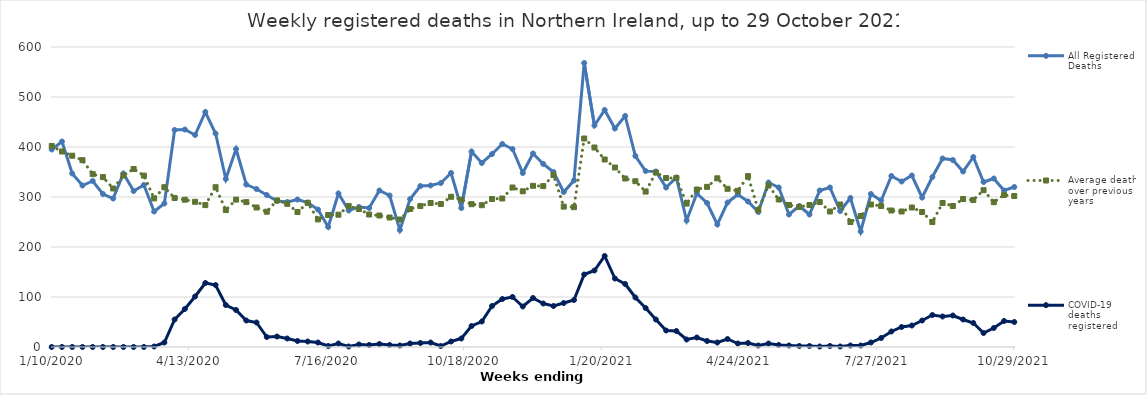
| Category | All Registered Deaths | Average deaths over previous 5 years | COVID-19 deaths registered |
|---|---|---|---|
| 1/10/20 | 395 | 402 | 0 |
| 1/17/20 | 411 | 391 | 0 |
| 1/24/20 | 347 | 382.6 | 0 |
| 1/31/20 | 323 | 373.6 | 0 |
| 2/7/20 | 332 | 345.8 | 0 |
| 2/14/20 | 306 | 339.8 | 0 |
| 2/21/20 | 297 | 317 | 0 |
| 2/28/20 | 347 | 343 | 0 |
| 3/6/20 | 312 | 356 | 0 |
| 3/13/20 | 324 | 342.8 | 0 |
| 3/20/20 | 271 | 297.2 | 1 |
| 3/27/20 | 287 | 319.6 | 9 |
| 4/3/20 | 434 | 298 | 55 |
| 4/10/20 | 435 | 294.6 | 76 |
| 4/17/20 | 424 | 290.4 | 101 |
| 4/24/20 | 470 | 283.8 | 128 |
| 5/1/20 | 427 | 319.6 | 124 |
| 5/8/20 | 336 | 273.8 | 84 |
| 5/15/20 | 396 | 294.8 | 74 |
| 5/22/20 | 325 | 289.8 | 53 |
| 5/29/20 | 316 | 279 | 49 |
| 6/5/20 | 304 | 270.6 | 20 |
| 6/12/20 | 292 | 293.2 | 21 |
| 6/19/20 | 290 | 286.4 | 17 |
| 6/26/20 | 295 | 270 | 12 |
| 7/3/20 | 289 | 288.2 | 11 |
| 7/10/20 | 275 | 255.2 | 9 |
| 7/17/20 | 240 | 264 | 2 |
| 7/24/20 | 307 | 264.6 | 7 |
| 7/31/20 | 273 | 282 | 1 |
| 8/7/20 | 280 | 276 | 5 |
| 8/14/20 | 278 | 265 | 4 |
| 8/21/20 | 313 | 263 | 6 |
| 8/28/20 | 303 | 259 | 4 |
| 9/4/20 | 234 | 255 | 3 |
| 9/11/20 | 296 | 276 | 7 |
| 9/18/20 | 322 | 282 | 8 |
| 9/25/20 | 323 | 288 | 9 |
| 10/2/20 | 328 | 286 | 2 |
| 10/9/20 | 348 | 300.4 | 11 |
| 10/16/20 | 278 | 294.8 | 17 |
| 10/23/20 | 391 | 285.6 | 42 |
| 10/30/20 | 368 | 283.6 | 51 |
| 11/6/20 | 386 | 296 | 82 |
| 11/13/20 | 406 | 297 | 96 |
| 11/20/20 | 396 | 319 | 100 |
| 11/27/20 | 348 | 311.4 | 81 |
| 12/4/20 | 387 | 322.4 | 98 |
| 12/11/20 | 366 | 321.8 | 87 |
| 12/18/20 | 350 | 343.8 | 82 |
| 12/25/20 | 310 | 280.8 | 88 |
| 1/1/21 | 333 | 279.6 | 94 |
| 1/8/21 | 568 | 417 | 145 |
| 1/15/21 | 443 | 399 | 153 |
| 1/22/21 | 474 | 375 | 182 |
| 1/29/21 | 437 | 359 | 137 |
| 2/5/21 | 462 | 337 | 126 |
| 2/12/21 | 382 | 331.6 | 99 |
| 2/19/21 | 352 | 310.8 | 78 |
| 2/26/21 | 351 | 349 | 55 |
| 3/5/21 | 319 | 338 | 33 |
| 3/12/21 | 339 | 338 | 32 |
| 3/19/21 | 253 | 286.8 | 15 |
| 3/26/21 | 307 | 315 | 19 |
| 4/2/21 | 288 | 320.2 | 12 |
| 4/9/21 | 245 | 337.4 | 9 |
| 4/16/21 | 289 | 316.4 | 16 |
| 4/23/21 | 305 | 312.4 | 7 |
| 4/30/21 | 291 | 341.8 | 8 |
| 5/7/21 | 270 | 274 | 3 |
| 5/14/21 | 329 | 323 | 7 |
| 5/21/21 | 319 | 295 | 4 |
| 5/28/21 | 265 | 284 | 3 |
| 6/4/21 | 282 | 280 | 2 |
| 6/11/21 | 265 | 284 | 2 |
| 6/18/21 | 313 | 290 | 1 |
| 6/25/21 | 319 | 271 | 2 |
| 7/2/21 | 272 | 285 | 1 |
| 7/9/21 | 298 | 250 | 3 |
| 7/16/21 | 231 | 262 | 3 |
| 7/23/21 | 306 | 285 | 9 |
| 7/30/21 | 293 | 282 | 18 |
| 8/6/21 | 342 | 273 | 31 |
| 8/13/21 | 331 | 271 | 40 |
| 8/20/21 | 343 | 279 | 43 |
| 8/27/21 | 299 | 270 | 53 |
| 9/3/21 | 340 | 250 | 64 |
| 9/10/21 | 377 | 288 | 61 |
| 9/17/21 | 374 | 282 | 63 |
| 9/24/21 | 351 | 296 | 55 |
| 10/1/21 | 380 | 294 | 48 |
| 10/8/21 | 330 | 313.6 | 28 |
| 10/15/21 | 337 | 289.6 | 38 |
| 10/22/21 | 313 | 304 | 52 |
| 10/29/21 | 320 | 302 | 50 |